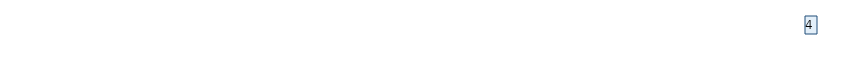
| Category | Итоговая оценка |
|---|---|
| Вопрос 5 | 4 |